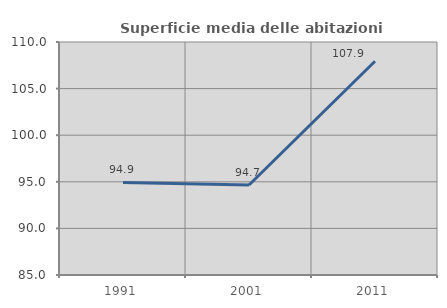
| Category | Superficie media delle abitazioni occupate |
|---|---|
| 1991.0 | 94.935 |
| 2001.0 | 94.653 |
| 2011.0 | 107.938 |